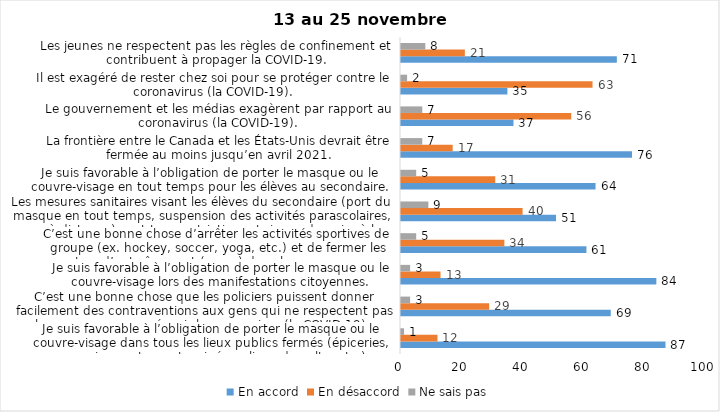
| Category | En accord | En désaccord | Ne sais pas |
|---|---|---|---|
| Je suis favorable à l’obligation de porter le masque ou le couvre-visage dans tous les lieux publics fermés (épiceries, magasins, restaurants, cinéma, lieux de culte, etc.). | 87 | 12 | 1 |
| C’est une bonne chose que les policiers puissent donner facilement des contraventions aux gens qui ne respectent pas les mesures pour prévenir le coronavirus (la COVID-19). | 69 | 29 | 3 |
| Je suis favorable à l’obligation de porter le masque ou le couvre-visage lors des manifestations citoyennes. | 84 | 13 | 3 |
| C’est une bonne chose d’arrêter les activités sportives de groupe (ex. hockey, soccer, yoga, etc.) et de fermer les centres d’entraînement (gyms) dans les zones rouges. | 61 | 34 | 5 |
| Les mesures sanitaires visant les élèves du secondaire (port du masque en tout temps, suspension des activités parascolaires, cours à distance) sont trop restrictives et risque de nuire à leur santé mentale et leur développement. | 51 | 40 | 9 |
| Je suis favorable à l’obligation de porter le masque ou le couvre-visage en tout temps pour les élèves au secondaire. | 64 | 31 | 5 |
| La frontière entre le Canada et les États-Unis devrait être fermée au moins jusqu’en avril 2021. | 76 | 17 | 7 |
| Le gouvernement et les médias exagèrent par rapport au coronavirus (la COVID-19). | 37 | 56 | 7 |
| Il est exagéré de rester chez soi pour se protéger contre le coronavirus (la COVID-19). | 35 | 63 | 2 |
| Les jeunes ne respectent pas les règles de confinement et contribuent à propager la COVID-19. | 71 | 21 | 8 |